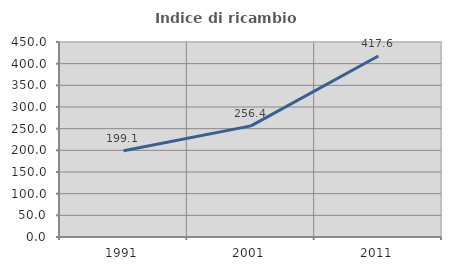
| Category | Indice di ricambio occupazionale  |
|---|---|
| 1991.0 | 199.085 |
| 2001.0 | 256.393 |
| 2011.0 | 417.647 |